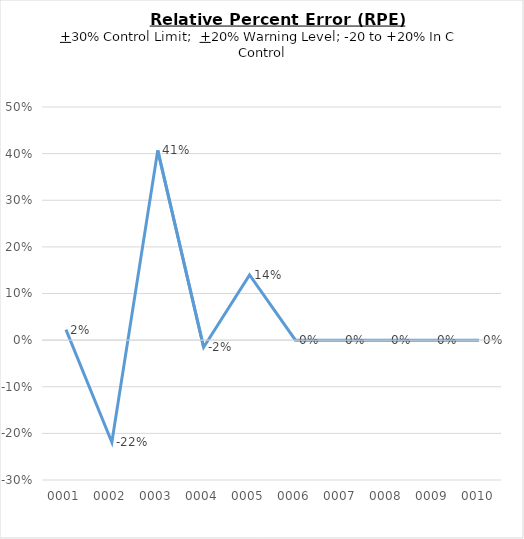
| Category | Relative Percent Error (RPE) |
|---|---|
| 0001 | 0.022 |
| 0002 | -0.219 |
| 0003 | 0.407 |
| 0004 | -0.015 |
| 0005 | 0.14 |
| 0006 | 0 |
| 0007 | 0 |
| 0008 | 0 |
| 0009 | 0 |
| 0010 | 0 |